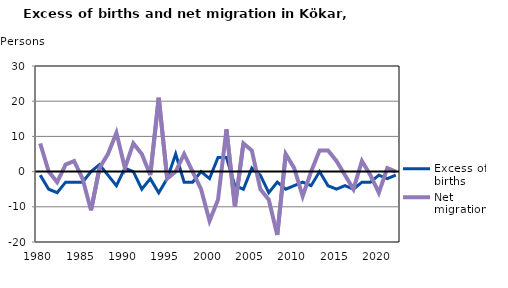
| Category | Excess of births | Net migration |
|---|---|---|
| 1980.0 | -1 | 8 |
| 1981.0 | -5 | 0 |
| 1982.0 | -6 | -3 |
| 1983.0 | -3 | 2 |
| 1984.0 | -3 | 3 |
| 1985.0 | -3 | -2 |
| 1986.0 | 0 | -11 |
| 1987.0 | 2 | 1 |
| 1988.0 | -1 | 5 |
| 1989.0 | -4 | 11 |
| 1990.0 | 1 | 1 |
| 1991.0 | 0 | 8 |
| 1992.0 | -5 | 5 |
| 1993.0 | -2 | -1 |
| 1994.0 | -6 | 21 |
| 1995.0 | -2 | -2 |
| 1996.0 | 5 | 0 |
| 1997.0 | -3 | 5 |
| 1998.0 | -3 | 0 |
| 1999.0 | 0 | -5 |
| 2000.0 | -2 | -14 |
| 2001.0 | 4 | -8 |
| 2002.0 | 4 | 12 |
| 2003.0 | -4 | -10 |
| 2004.0 | -5 | 8 |
| 2005.0 | 1 | 6 |
| 2006.0 | -1 | -5 |
| 2007.0 | -6 | -8 |
| 2008.0 | -3 | -18 |
| 2009.0 | -5 | 5 |
| 2010.0 | -4 | 1 |
| 2011.0 | -3 | -7 |
| 2012.0 | -4 | 0 |
| 2013.0 | 0 | 6 |
| 2014.0 | -4 | 6 |
| 2015.0 | -5 | 3 |
| 2016.0 | -4 | -1 |
| 2017.0 | -5 | -5 |
| 2018.0 | -3 | 3 |
| 2019.0 | -3 | -1 |
| 2020.0 | -1 | -6 |
| 2021.0 | -2 | 1 |
| 2022.0 | -1 | 0 |